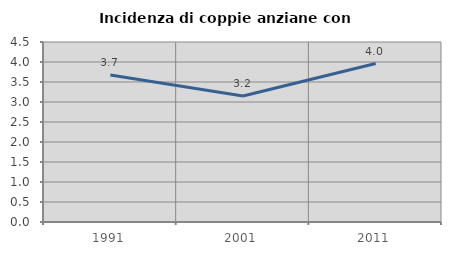
| Category | Incidenza di coppie anziane con figli |
|---|---|
| 1991.0 | 3.677 |
| 2001.0 | 3.152 |
| 2011.0 | 3.962 |